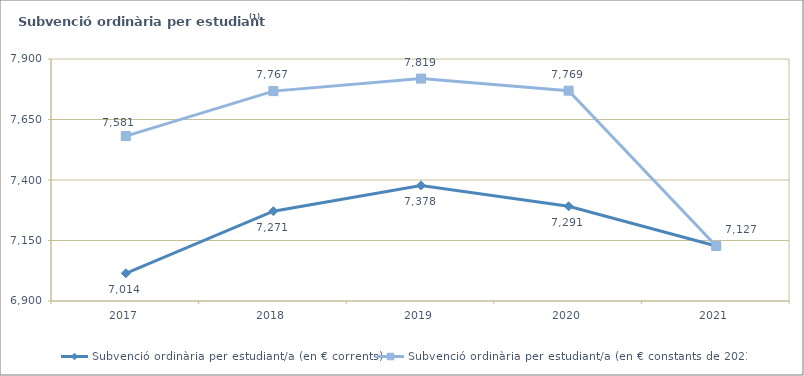
| Category | Subvenció ordinària per estudiant/a (en € corrents) | Subvenció ordinària per estudiant/a (en € constants de 2021) |
|---|---|---|
| 2017 | 7014.461 | 7581.445 |
| 2018 | 7271.195 | 7767.277 |
| 2019 | 7377.544 | 7819.111 |
| 2020 | 7291.413 | 7769.001 |
| 2021 | 7127.384 | 7127.384 |